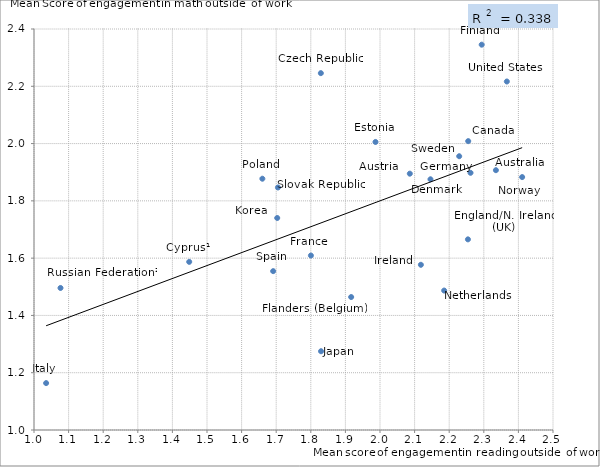
| Category | Series 1 |
|---|---|
| 2.334999768616913 | 1.907 |
| 2.086159823737894 | 1.895 |
| 2.2549539377571253 | 2.008 |
| 1.448602093900424 | 1.587 |
| 1.8290226793229745 | 2.246 |
| 2.1458730241423365 | 1.875 |
| 2.2541477722971615 | 1.666 |
| 1.9870207636059605 | 2.006 |
| 2.2939377636935876 | 2.345 |
| 1.9166919051300721 | 1.464 |
| 1.800324030407017 | 1.609 |
| 2.2616363662456065 | 1.898 |
| 2.118141909319378 | 1.577 |
| 1.0350295692125813 | 1.164 |
| 1.8296259885937434 | 1.275 |
| 1.7029602007531934 | 1.74 |
| 2.185436157183366 | 1.487 |
| 2.4108449066618145 | 1.883 |
| 1.6600149224627787 | 1.877 |
| 1.0765986772696856 | 1.496 |
| 1.7050357572394406 | 1.847 |
| 1.6912206536198848 | 1.555 |
| 2.2288906139148317 | 1.956 |
| 2.3665927914267986 | 2.217 |